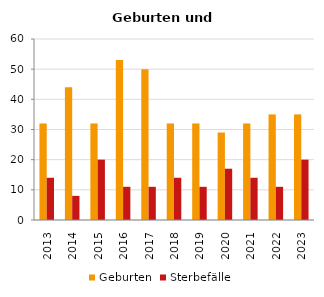
| Category | Geburten | Sterbefälle |
|---|---|---|
| 2013.0 | 32 | 14 |
| 2014.0 | 44 | 8 |
| 2015.0 | 32 | 20 |
| 2016.0 | 53 | 11 |
| 2017.0 | 50 | 11 |
| 2018.0 | 32 | 14 |
| 2019.0 | 32 | 11 |
| 2020.0 | 29 | 17 |
| 2021.0 | 32 | 14 |
| 2022.0 | 35 | 11 |
| 2023.0 | 35 | 20 |